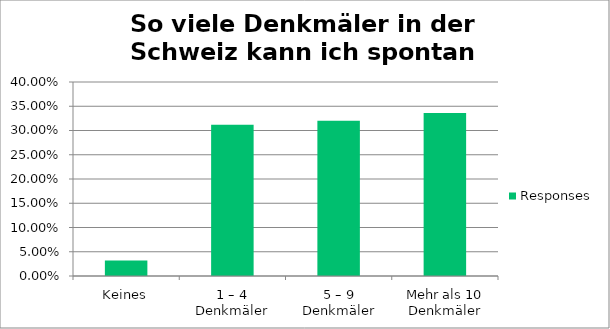
| Category | Responses |
|---|---|
| Keines | 0.032 |
| 1 – 4 Denkmäler | 0.312 |
| 5 – 9 Denkmäler | 0.32 |
| Mehr als 10 Denkmäler | 0.336 |